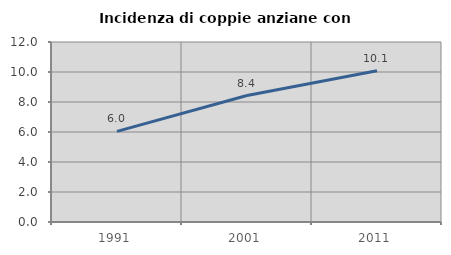
| Category | Incidenza di coppie anziane con figli |
|---|---|
| 1991.0 | 6.04 |
| 2001.0 | 8.429 |
| 2011.0 | 10.084 |